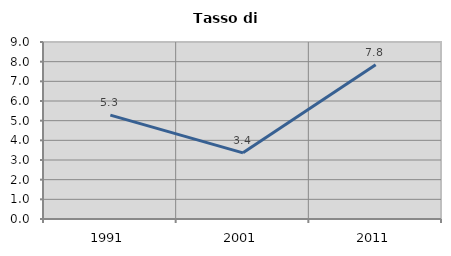
| Category | Tasso di disoccupazione   |
|---|---|
| 1991.0 | 5.28 |
| 2001.0 | 3.363 |
| 2011.0 | 7.847 |